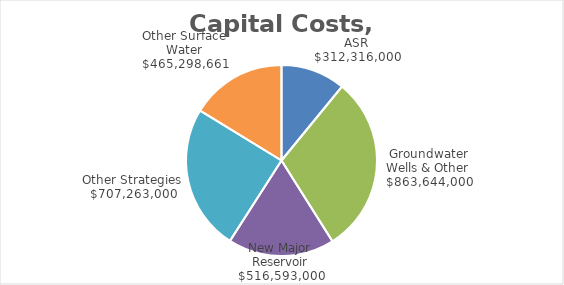
| Category | Series 0 |
|---|---|
| ASR | 312316000 |
| Groundwater Wells & Other | 863644000 |
| New Major Reservoir | 516593000 |
| Other Strategies | 707263000 |
| Other Surface Water | 465298661 |